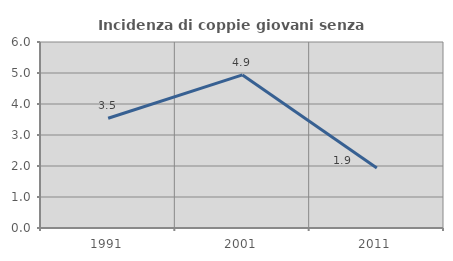
| Category | Incidenza di coppie giovani senza figli |
|---|---|
| 1991.0 | 3.54 |
| 2001.0 | 4.938 |
| 2011.0 | 1.938 |